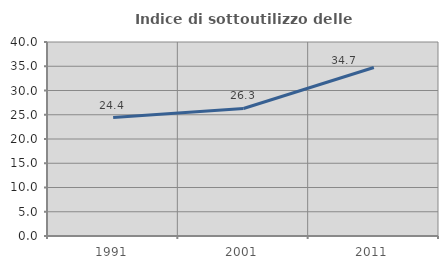
| Category | Indice di sottoutilizzo delle abitazioni  |
|---|---|
| 1991.0 | 24.414 |
| 2001.0 | 26.292 |
| 2011.0 | 34.739 |